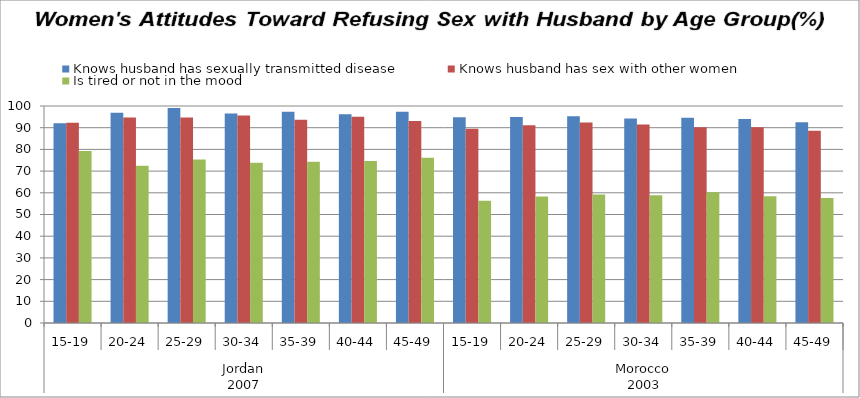
| Category | Knows husband has sexually transmitted disease  | Knows husband has sex with other women  | Is tired or not in the mood  |
|---|---|---|---|
| 0 | 92.1 | 92.3 | 79.3 |
| 1 | 96.9 | 94.7 | 72.5 |
| 2 | 99.1 | 94.7 | 75.3 |
| 3 | 96.5 | 95.6 | 73.8 |
| 4 | 97.4 | 93.7 | 74.3 |
| 5 | 96.2 | 95 | 74.7 |
| 6 | 97.3 | 93.1 | 76.1 |
| 7 | 94.8 | 89.5 | 56.3 |
| 8 | 94.9 | 91.1 | 58.3 |
| 9 | 95.3 | 92.4 | 59.2 |
| 10 | 94.2 | 91.5 | 58.9 |
| 11 | 94.6 | 90.2 | 60.3 |
| 12 | 94 | 90.2 | 58.4 |
| 13 | 92.5 | 88.6 | 57.6 |